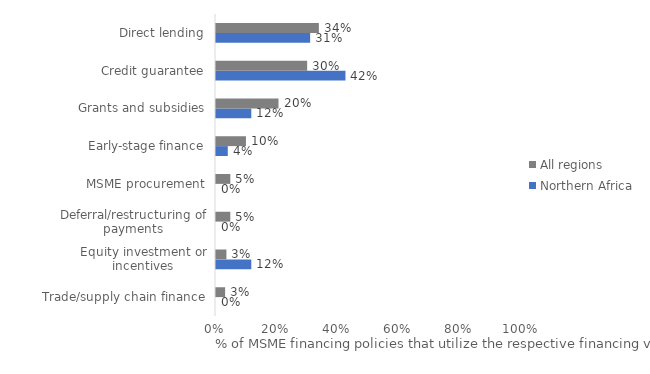
| Category | Northern Africa | All regions |
|---|---|---|
| Trade/supply chain finance | 0 | 0.03 |
| Equity investment or incentives | 0.115 | 0.034 |
| Deferral/restructuring of payments | 0 | 0.047 |
| MSME procurement | 0 | 0.047 |
| Early-stage finance | 0.038 | 0.098 |
| Grants and subsidies | 0.115 | 0.204 |
| Credit guarantee | 0.423 | 0.298 |
| Direct lending | 0.308 | 0.336 |